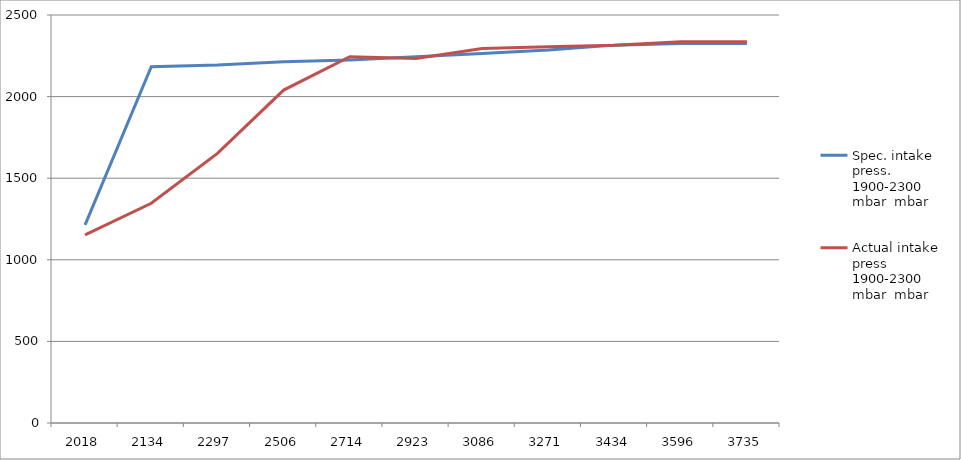
| Category | Spec. intake press. 1900-2300 mbar  mbar | Actual intake press 1900-2300 mbar  mbar |
|---|---|---|
| 2018.0 | 1213.8 | 1152.6 |
| 2134.0 | 2182.8 | 1346.4 |
| 2297.0 | 2193 | 1652.4 |
| 2506.0 | 2213.4 | 2040 |
| 2714.0 | 2223.6 | 2244 |
| 2923.0 | 2244 | 2233.8 |
| 3086.0 | 2264.4 | 2295 |
| 3271.0 | 2284.8 | 2305.2 |
| 3434.0 | 2315.4 | 2315.4 |
| 3596.0 | 2325.6 | 2335.8 |
| 3735.0 | 2325.6 | 2335.8 |